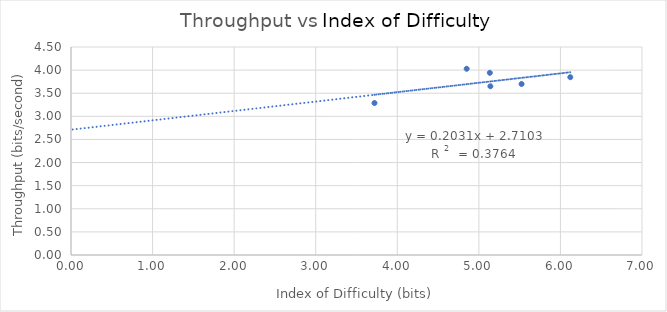
| Category | Throughput |
|---|---|
| 5.141498388106933 | 3.65 |
| 5.52370643820229 | 3.7 |
| 6.1209611710083 | 3.847 |
| 3.720436495832758 | 3.288 |
| 4.850555672917473 | 4.029 |
| 5.134555720124009 | 3.941 |